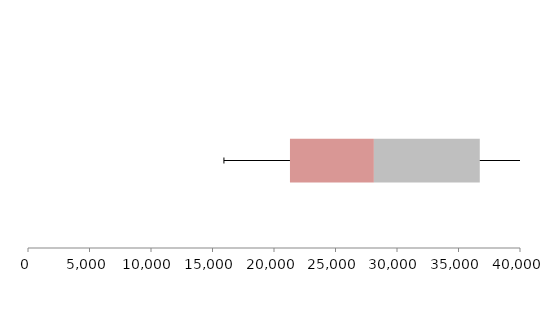
| Category | Series 1 | Series 2 | Series 3 |
|---|---|---|---|
| 0 | 21298.072 | 6822.668 | 8608.902 |